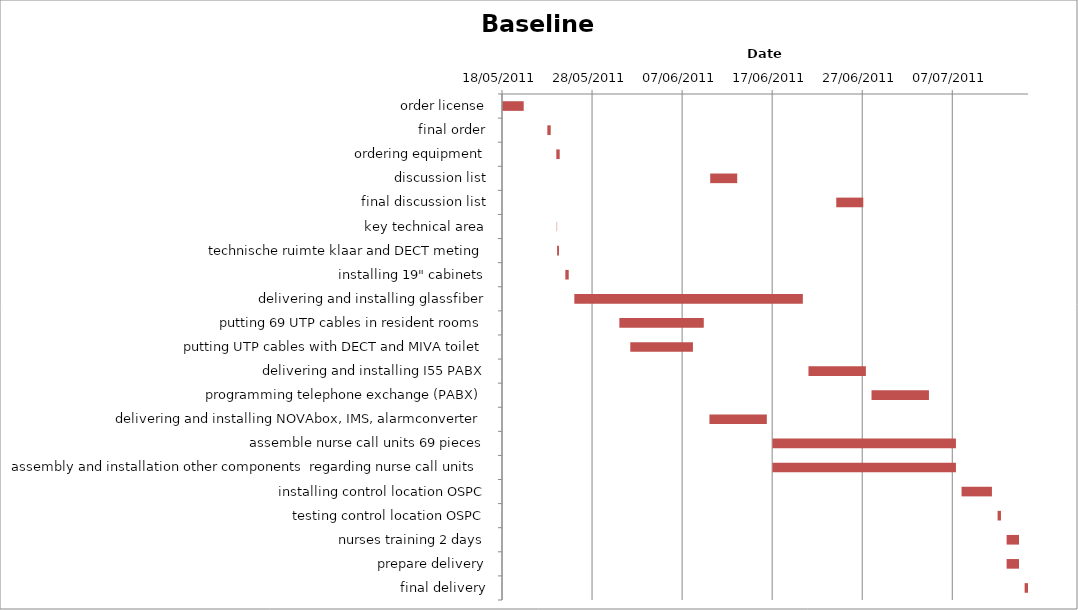
| Category | Baseline start | Actual duration |
|---|---|---|
| order license | 40681.333 | 2.375 |
| final order | 40686.333 | 0.375 |
| ordering equipment | 40687.333 | 0.375 |
| discussion list | 40704.417 | 3 |
| final discussion list | 40718.417 | 3 |
| key technical area | 40687.375 | 0.042 |
| technische ruimte klaar and DECT meting | 40687.417 | 0.208 |
| installing 19" cabinets | 40688.333 | 0.375 |
| delivering and installing glassfiber | 40689.333 | 25.375 |
| putting 69 UTP cables in resident rooms | 40694.333 | 9.375 |
| putting UTP cables with DECT and MIVA toilet | 40695.542 | 6.958 |
| delivering and installing I55 PABX | 40715.333 | 6.375 |
| programming telephone exchange (PABX) | 40722.333 | 6.375 |
| delivering and installing NOVAbox, IMS, alarmconverter | 40704.333 | 6.375 |
| assemble nurse call units 69 pieces | 40711.333 | 20.375 |
| assembly and installation other components  regarding nurse call units | 40711.333 | 20.375 |
| installing control location OSPC | 40732.333 | 3.375 |
| testing control location OSPC | 40736.333 | 0.375 |
| nurses training 2 days | 40737.333 | 1.375 |
| prepare delivery | 40737.333 | 1.375 |
| final delivery | 40739.333 | 0.375 |